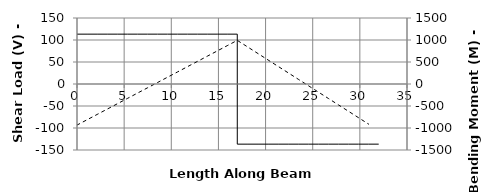
| Category | V |
|---|---|
| 0.0 | 113.297 |
| 0.0 | 113.297 |
| 0.0 | 113.297 |
| 1.0666666666666667 | 113.297 |
| 2.1333333333333333 | 113.297 |
| 3.2 | 113.297 |
| 4.266666666666667 | 113.297 |
| 5.333333333333333 | 113.297 |
| 6.4 | 113.297 |
| 7.466666666666667 | 113.297 |
| 8.533333333333333 | 113.297 |
| 9.6 | 113.297 |
| 10.666666666666666 | 113.297 |
| 11.733333333333333 | 113.297 |
| 12.8 | 113.297 |
| 13.866666666666667 | 113.297 |
| 14.933333333333334 | 113.297 |
| 16.0 | 113.297 |
| 16.999 | 113.297 |
| 17.001 | -136.703 |
| 17.066666666666666 | -136.703 |
| 18.133333333333333 | -136.703 |
| 19.2 | -136.703 |
| 20.266666666666666 | -136.703 |
| 21.333333333333332 | -136.703 |
| 22.4 | -136.703 |
| 23.466666666666665 | -136.703 |
| 24.53333333333333 | -136.703 |
| 25.6 | -136.703 |
| 26.666666666666668 | -136.703 |
| 27.733333333333334 | -136.703 |
| 28.8 | -136.703 |
| 29.866666666666667 | -136.703 |
| 30.933333333333334 | -136.703 |
| 32.0 | -136.703 |